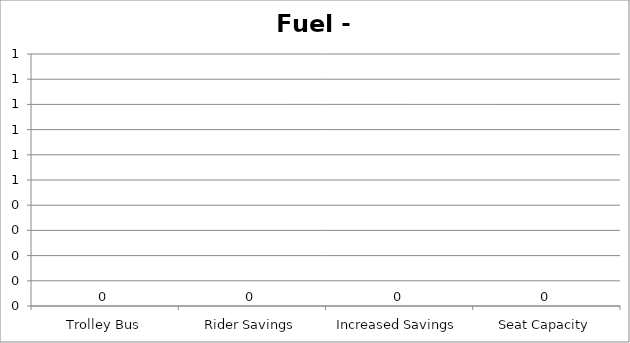
| Category | Fuel - GGE |
|---|---|
| Trolley Bus | 0 |
| Rider Savings | 0 |
| Increased Savings | 0 |
| Seat Capacity | 0 |